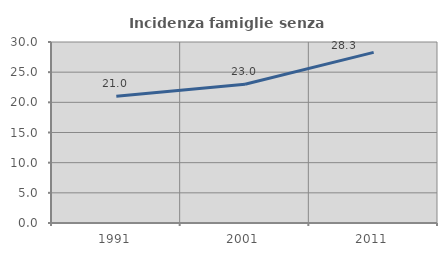
| Category | Incidenza famiglie senza nuclei |
|---|---|
| 1991.0 | 21.021 |
| 2001.0 | 22.987 |
| 2011.0 | 28.286 |